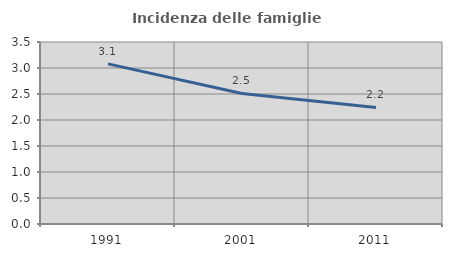
| Category | Incidenza delle famiglie numerose |
|---|---|
| 1991.0 | 3.079 |
| 2001.0 | 2.511 |
| 2011.0 | 2.241 |